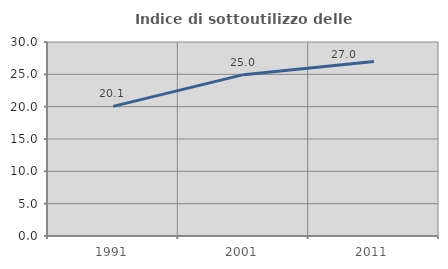
| Category | Indice di sottoutilizzo delle abitazioni  |
|---|---|
| 1991.0 | 20.051 |
| 2001.0 | 24.953 |
| 2011.0 | 26.969 |